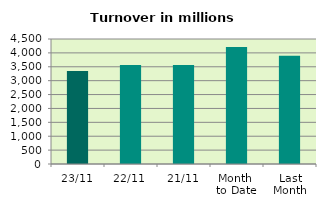
| Category | Series 0 |
|---|---|
| 23/11 | 3344.573 |
| 22/11 | 3564.654 |
| 21/11 | 3560.809 |
| Month 
to Date | 4214.66 |
| Last
Month | 3895.685 |